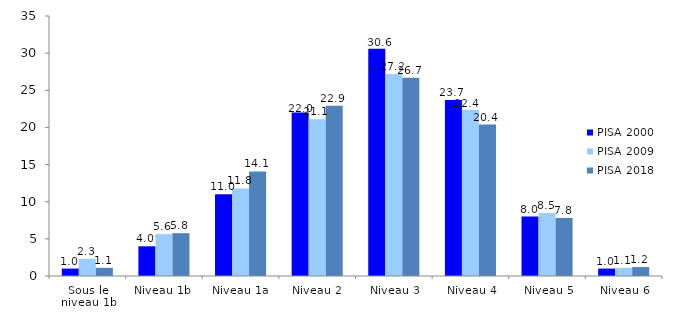
| Category | PISA 2000 | PISA 2009 | PISA 2018 |
|---|---|---|---|
| Sous le niveau 1b | 1 | 2.32 | 1.101 |
| Niveau 1b | 4 | 5.641 | 5.766 |
| Niveau 1a | 11 | 11.791 | 14.079 |
| Niveau 2 | 22 | 21.096 | 22.903 |
| Niveau 3
 | 30.6 | 27.206 | 26.693 |
| Niveau 4
 | 23.7 | 22.38 | 20.393 |
| Niveau 5
 | 8 | 8.475 | 7.812 |
| Niveau 6
 | 1 | 1.09 | 1.203 |